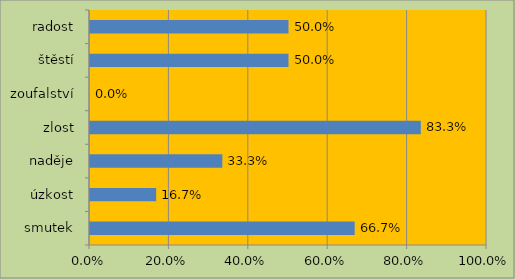
| Category | Series 0 |
|---|---|
| smutek | 0.667 |
| úzkost | 0.167 |
| naděje | 0.333 |
| zlost | 0.833 |
| zoufalství | 0 |
| štěstí | 0.5 |
| radost | 0.5 |